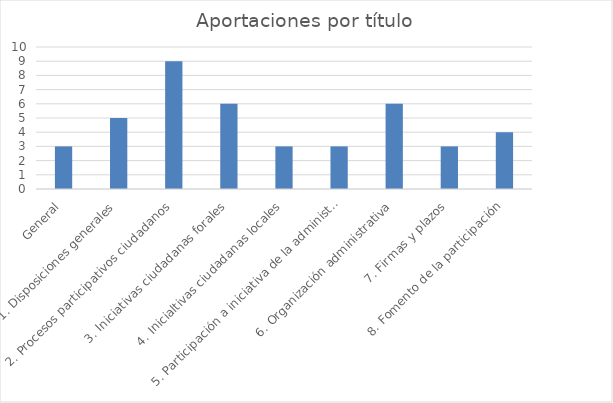
| Category | Nº aportaciones |
|---|---|
| General | 3 |
| 1. Disposiciones generales | 5 |
| 2. Procesos participativos ciudadanos | 9 |
| 3. Iniciativas ciudadanas forales | 6 |
| 4. Inicialtivas ciudadanas locales | 3 |
| 5. Participación a iniciativa de la administración foral | 3 |
| 6. Organización administrativa | 6 |
| 7. Firmas y plazos | 3 |
| 8. Fomento de la participación | 4 |